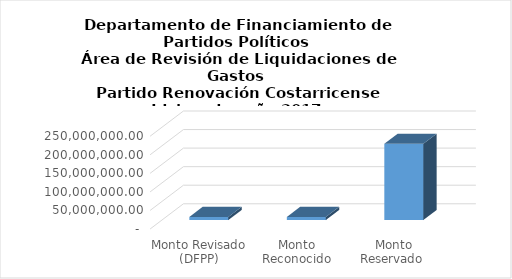
| Category | Series 0 |
|---|---|
| Monto Revisado (DFPP) | 8393392.65 |
| Monto Reconocido (TSE) | 8355392.65 |
| Monto Reservado  | 205428547.806 |